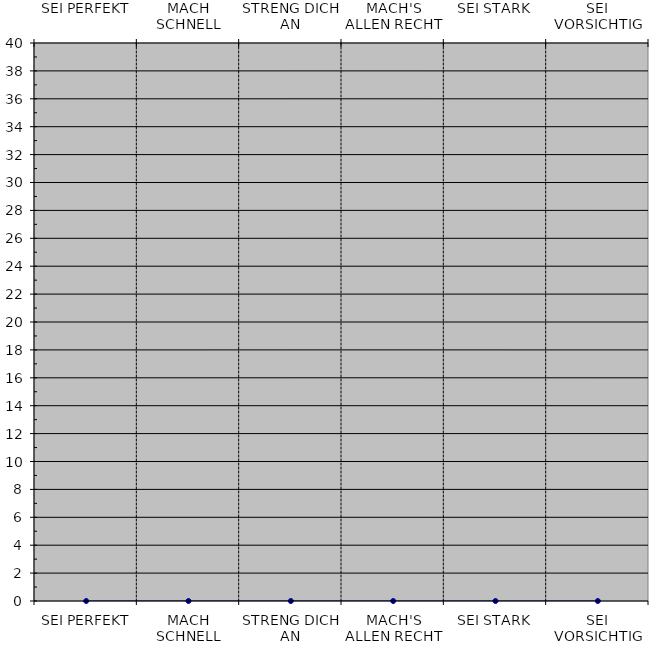
| Category | Series 0 |
|---|---|
| SEI PERFEKT | 0 |
| MACH SCHNELL | 0 |
| STRENG DICH AN | 0 |
| MACH'S ALLEN RECHT | 0 |
| SEI STARK | 0 |
| SEI VORSICHTIG | 0 |